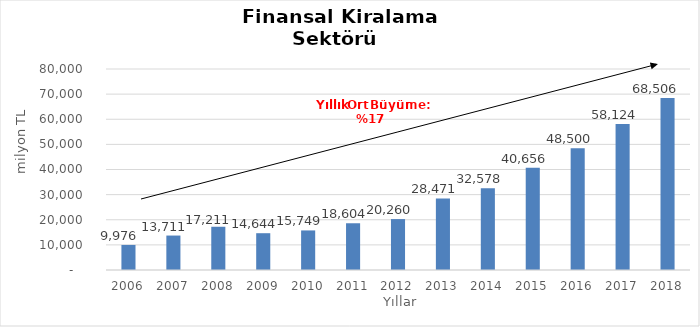
| Category | Finansal Kiralama  |
|---|---|
| 2006.0 | 9976.07 |
| 2007.0 | 13710.562 |
| 2008.0 | 17210.614 |
| 2009.0 | 14644.05 |
| 2010.0 | 15748.853 |
| 2011.0 | 18604.083 |
| 2012.0 | 20259.96 |
| 2013.0 | 28470.82 |
| 2014.0 | 32578 |
| 2015.0 | 40656 |
| 2016.0 | 48500 |
| 2017.0 | 58124 |
| 2018.0 | 68506 |